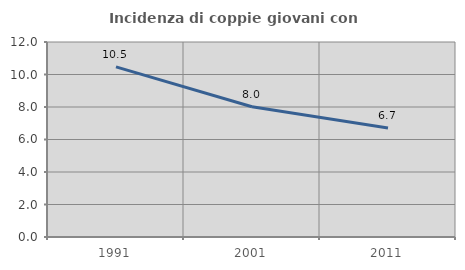
| Category | Incidenza di coppie giovani con figli |
|---|---|
| 1991.0 | 10.469 |
| 2001.0 | 8.017 |
| 2011.0 | 6.704 |